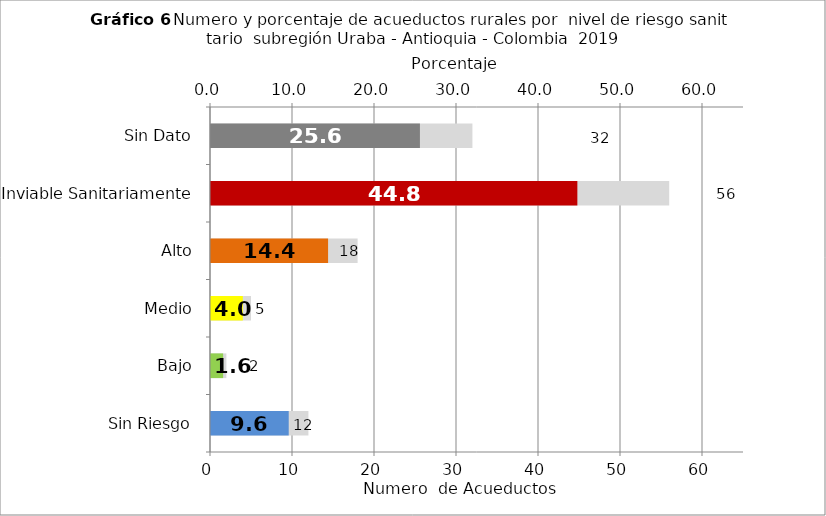
| Category | Número de Sistemas |
|---|---|
| Sin Riesgo | 12 |
| Bajo | 2 |
| Medio | 5 |
| Alto | 18 |
| Inviable Sanitariamente | 56 |
| Sin Dato | 32 |